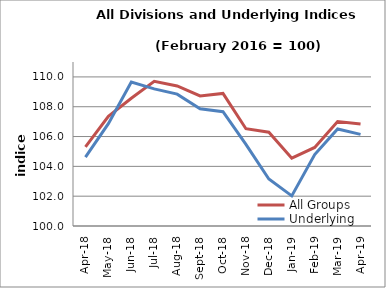
| Category | All Groups | Underlying |
|---|---|---|
| 2018-04-01 | 105.309 | 104.614 |
| 2018-05-01 | 107.355 | 106.863 |
| 2018-06-01 | 108.567 | 109.659 |
| 2018-07-01 | 109.702 | 109.198 |
| 2018-08-01 | 109.392 | 108.845 |
| 2018-09-01 | 108.722 | 107.857 |
| 2018-10-01 | 108.895 | 107.664 |
| 2018-11-01 | 106.524 | 105.471 |
| 2018-12-01 | 106.292 | 103.148 |
| 2019-01-01 | 104.55 | 102.019 |
| 2019-02-01 | 105.272 | 104.794 |
| 2019-03-01 | 107.012 | 106.51 |
| 2019-04-01 | 106.842 | 106.143 |